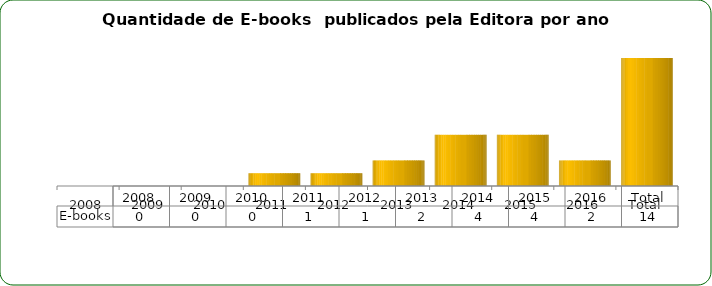
| Category | E-books |
|---|---|
| 2008 | 0 |
| 2009 | 0 |
| 2010 | 0 |
| 2011 | 1 |
| 2012 | 1 |
| 2013 | 2 |
| 2014 | 4 |
| 2015 | 4 |
| 2016 | 2 |
| Total | 14 |